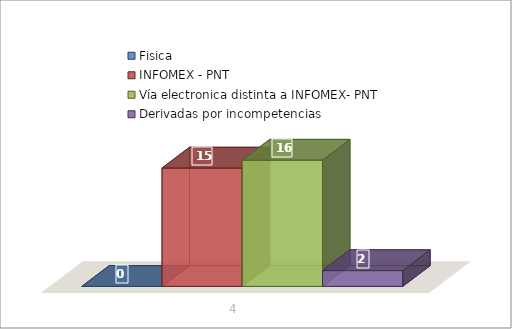
| Category | Fisica | INFOMEX - PNT | Vía electronica distinta a INFOMEX- PNT | Derivadas por incompetencias |
|---|---|---|---|---|
| 0 | 0 | 15 | 16 | 2 |